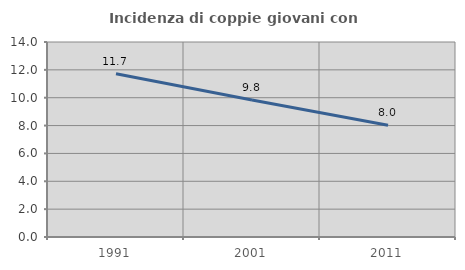
| Category | Incidenza di coppie giovani con figli |
|---|---|
| 1991.0 | 11.727 |
| 2001.0 | 9.842 |
| 2011.0 | 8.023 |